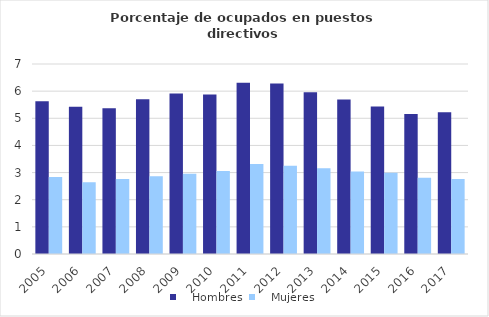
| Category |    Hombres |    Mujeres |
|---|---|---|
| 2005.0 | 5.624 | 2.835 |
| 2006.0 | 5.425 | 2.644 |
| 2007.0 | 5.371 | 2.767 |
| 2008.0 | 5.697 | 2.865 |
| 2009.0 | 5.91 | 2.955 |
| 2010.0 | 5.874 | 3.061 |
| 2011.0 | 6.309 | 3.311 |
| 2012.0 | 6.279 | 3.254 |
| 2013.0 | 5.963 | 3.155 |
| 2014.0 | 5.695 | 3.041 |
| 2015.0 | 5.437 | 2.993 |
| 2016.0 | 5.162 | 2.805 |
| 2017.0 | 5.22 | 2.759 |